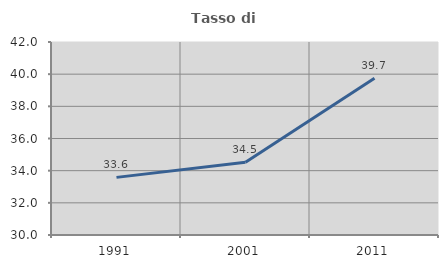
| Category | Tasso di occupazione   |
|---|---|
| 1991.0 | 33.583 |
| 2001.0 | 34.519 |
| 2011.0 | 39.745 |